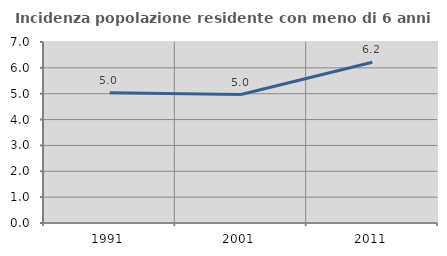
| Category | Incidenza popolazione residente con meno di 6 anni |
|---|---|
| 1991.0 | 5.035 |
| 2001.0 | 4.967 |
| 2011.0 | 6.214 |